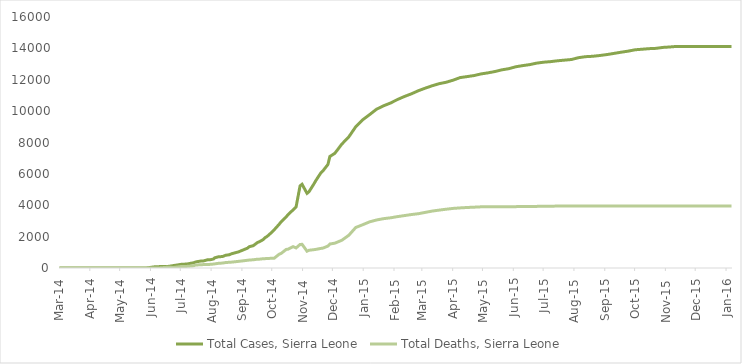
| Category | Total Cases, Sierra Leone | Total Deaths, Sierra Leone |
|---|---|---|
| 2014-03-01 | 0 | 0 |
| 2014-03-02 | 0 | 0 |
| 2014-03-03 | 0 | 0 |
| 2014-03-04 | 0 | 0 |
| 2014-03-05 | 0 | 0 |
| 2014-03-06 | 0 | 0 |
| 2014-03-07 | 0 | 0 |
| 2014-03-08 | 0 | 0 |
| 2014-03-09 | 0 | 0 |
| 2014-03-10 | 0 | 0 |
| 2014-03-11 | 0 | 0 |
| 2014-03-12 | 0 | 0 |
| 2014-03-13 | 0 | 0 |
| 2014-03-14 | 0 | 0 |
| 2014-03-15 | 0 | 0 |
| 2014-03-16 | 0 | 0 |
| 2014-03-17 | 0 | 0 |
| 2014-03-18 | 0 | 0 |
| 2014-03-19 | 0 | 0 |
| 2014-03-20 | 0 | 0 |
| 2014-03-21 | 0 | 0 |
| 2014-03-22 | 0 | 0 |
| 2014-03-23 | 0 | 0 |
| 2014-03-24 | 0 | 0 |
| 2014-03-25 | 0 | 0 |
| 2014-03-26 | 0 | 0 |
| 2014-03-27 | 6 | 5 |
| 2014-03-31 | 0 | 0 |
| 2014-04-01 | 0 | 0 |
| 2014-04-02 | 0 | 0 |
| 2014-04-07 | 0 | 0 |
| 2014-04-10 | 0 | 0 |
| 2014-04-17 | 0 | 0 |
| 2014-04-21 | 0 | 0 |
| 2014-04-23 | 0 | 0 |
| 2014-04-30 | 0 | 0 |
| 2014-05-05 | 0 | 0 |
| 2014-05-14 | 0 | 0 |
| 2014-05-23 | 0 | 0 |
| 2014-05-27 | 1 | 4 |
| 2014-05-28 | 16 | 5 |
| 2014-06-02 | 50 | 6 |
| 2014-06-05 | 81 | 7 |
| 2014-06-10 | 89 | 7 |
| 2014-06-11 | 117 | 19 |
| 2014-06-18 | 97 | 49 |
| 2014-06-24 | 158 | 34 |
| 2014-07-02 | 239 | 99 |
| 2014-07-07 | 252 | 101 |
| 2014-07-08 | 305 | 127 |
| 2014-07-14 | 337 | 142 |
| 2014-07-16 | 386 | 192 |
| 2014-07-21 | 442 | 206 |
| 2014-07-24 | 454 | 219 |
| 2014-07-28 | 525 | 224 |
| 2014-07-31 | 533 | 233 |
| 2014-08-03 | 574 | 252 |
| 2014-08-04 | 646 | 273 |
| 2014-08-08 | 717 | 298 |
| 2014-08-12 | 730 | 315 |
| 2014-08-13 | 783 | 334 |
| 2014-08-15 | 810 | 348 |
| 2014-08-19 | 848 | 365 |
| 2014-08-21 | 907 | 374 |
| 2014-08-22 | 910 | 392 |
| 2014-08-28 | 1026 | 422 |
| 2014-09-06 | 1261 | 491 |
| 2014-09-08 | 1361 | 509 |
| 2014-09-12 | 1424 | 524 |
| 2014-09-16 | 1620 | 562 |
| 2014-09-18 | 1673 | 562 |
| 2014-09-22 | 1813 | 593 |
| 2014-09-24 | 1940 | 597 |
| 2014-09-26 | 2021 | 605 |
| 2014-10-01 | 2304 | 622 |
| 2014-10-03 | 2437 | 623 |
| 2014-10-08 | 2789 | 879 |
| 2014-10-10 | 2950 | 930 |
| 2014-10-15 | 3252 | 1183 |
| 2014-10-17 | 3410 | 1200 |
| 2014-10-22 | 3706 | 1359 |
| 2014-10-25 | 3896 | 1281 |
| 2014-10-29 | 5235 | 1500 |
| 2014-10-31 | 5338 | 1510 |
| 2014-11-05 | 4759 | 1070 |
| 2014-11-07 | 4862 | 1130 |
| 2014-11-12 | 5368 | 1169 |
| 2014-11-14 | 5586 | 1187 |
| 2014-11-19 | 6073 | 1250 |
| 2014-11-21 | 6190 | 1267 |
| 2014-11-26 | 6599 | 1398 |
| 2014-11-28 | 7109 | 1530 |
| 2014-12-03 | 7312 | 1583 |
| 2014-12-10 | 7897 | 1768 |
| 2014-12-17 | 8356 | 2085 |
| 2014-12-24 | 9004 | 2582 |
| 2014-12-31 | 9446 | 2758 |
| 2015-01-07 | 9780 | 2943 |
| 2015-01-14 | 10124 | 3062 |
| 2015-01-21 | 10340 | 3145 |
| 2015-01-28 | 10518 | 3199 |
| 2015-02-04 | 10740 | 3276 |
| 2015-02-11 | 10934 | 3341 |
| 2015-02-18 | 11103 | 3408 |
| 2015-02-25 | 11301 | 3461 |
| 2015-03-04 | 11466 | 3546 |
| 2015-03-11 | 11619 | 3629 |
| 2015-03-18 | 11751 | 3691 |
| 2015-03-25 | 11841 | 3747 |
| 2015-04-01 | 11974 | 3799 |
| 2015-04-08 | 12138 | 3831 |
| 2015-04-15 | 12201 | 3857 |
| 2015-04-22 | 12267 | 3877 |
| 2015-04-29 | 12371 | 3899 |
| 2015-05-06 | 12440 | 3903 |
| 2015-05-13 | 12523 | 3904 |
| 2015-05-20 | 12632 | 3907 |
| 2015-05-27 | 12706 | 3908 |
| 2015-06-03 | 12827 | 3912 |
| 2015-06-10 | 12901 | 3915 |
| 2015-06-17 | 12965 | 3919 |
| 2015-06-24 | 13059 | 3928 |
| 2015-07-01 | 13119 | 3932 |
| 2015-07-08 | 13155 | 3940 |
| 2015-07-15 | 13209 | 3947 |
| 2015-07-22 | 13250 | 3949 |
| 2015-07-29 | 13290 | 3951 |
| 2015-08-05 | 13406 | 3951 |
| 2015-08-12 | 13470 | 3951 |
| 2015-08-19 | 13494 | 3952 |
| 2015-08-26 | 13541 | 3952 |
| 2015-09-03 | 13609 | 3953 |
| 2015-09-10 | 13683 | 3953 |
| 2015-09-17 | 13756 | 3953 |
| 2015-09-24 | 13823 | 3955 |
| 2015-10-01 | 13911 | 3955 |
| 2015-10-08 | 13945 | 3955 |
| 2015-10-15 | 13982 | 3955 |
| 2015-10-22 | 14001 | 3955 |
| 2015-10-29 | 14061 | 3955 |
| 2015-11-05 | 14089 | 3955 |
| 2015-11-11 | 14122 | 3955 |
| 2015-11-18 | 14122 | 3955 |
| 2015-11-25 | 14122 | 3955 |
| 2015-12-02 | 14122 | 3955 |
| 2015-12-09 | 14122 | 3955 |
| 2015-12-16 | 14122 | 3955 |
| 2015-12-23 | 14122 | 3955 |
| 2015-12-30 | 14122 | 3955 |
| 2016-01-06 | 14122 | 3955 |